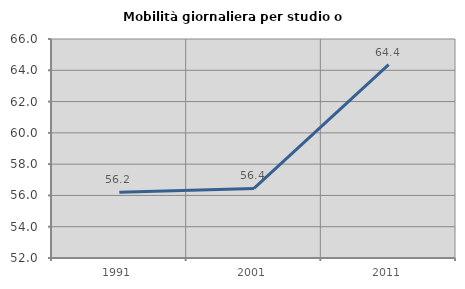
| Category | Mobilità giornaliera per studio o lavoro |
|---|---|
| 1991.0 | 56.206 |
| 2001.0 | 56.445 |
| 2011.0 | 64.362 |